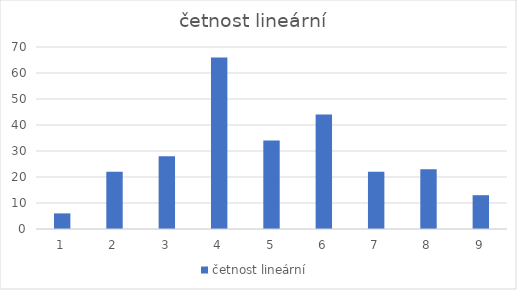
| Category | četnost lineární  |
|---|---|
| 1.0 | 6 |
| 2.0 | 22 |
| 3.0 | 28 |
| 4.0 | 66 |
| 5.0 | 34 |
| 6.0 | 44 |
| 7.0 | 22 |
| 8.0 | 23 |
| 9.0 | 13 |